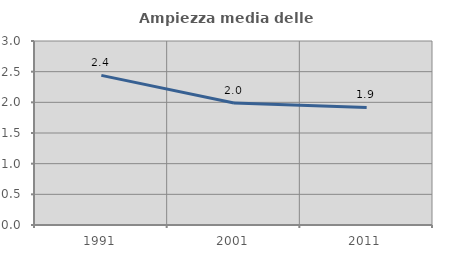
| Category | Ampiezza media delle famiglie |
|---|---|
| 1991.0 | 2.439 |
| 2001.0 | 1.988 |
| 2011.0 | 1.917 |